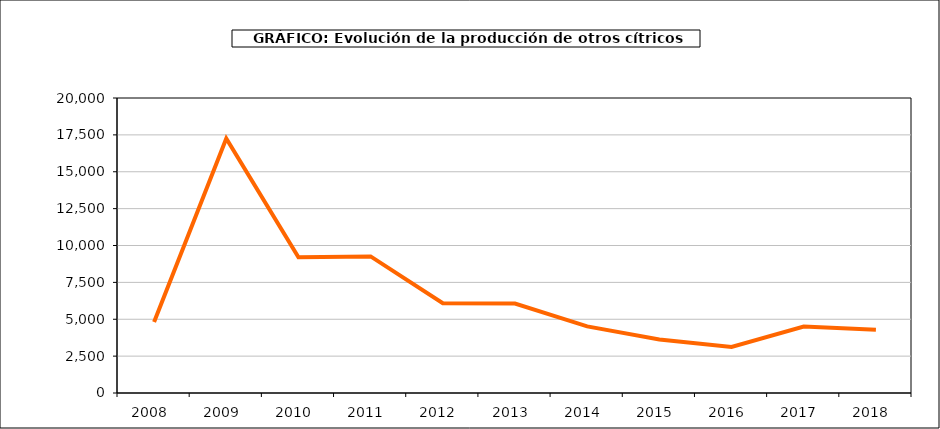
| Category | producción |
|---|---|
| 2008.0 | 4816 |
| 2009.0 | 17251 |
| 2010.0 | 9197 |
| 2011.0 | 9260 |
| 2012.0 | 6091 |
| 2013.0 | 6060 |
| 2014.0 | 4514 |
| 2015.0 | 3626 |
| 2016.0 | 3116 |
| 2017.0 | 4501 |
| 2018.0 | 4287 |